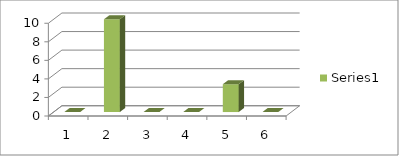
| Category | Series 0 |
|---|---|
| 0 | 0 |
| 1 | 10 |
| 2 | 0 |
| 3 | 0 |
| 4 | 3 |
| 5 | 0 |